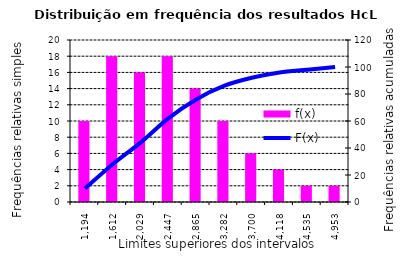
| Category | f(x) |
|---|---|
| 1194.145420211862 | 10 |
| 1611.7738264497475 | 18 |
| 2029.402232687633 | 16 |
| 2447.0306389255184 | 18 |
| 2864.659045163404 | 14 |
| 3282.287451401289 | 10 |
| 3699.9158576391746 | 6 |
| 4117.54426387706 | 4 |
| 4535.1726701149455 | 2 |
| 4952.801076352831 | 2 |